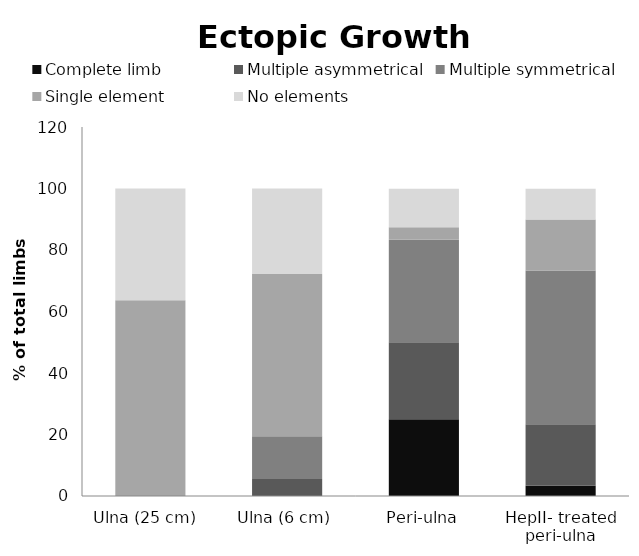
| Category | Complete limb | Multiple asymmetrical | Multiple symmetrical | Single element | No elements |
|---|---|---|---|---|---|
| Ulna (25 cm)  | 0 | 0 | 0 | 63.636 | 36.364 |
| Ulna (6 cm) | 0 | 5.556 | 13.889 | 52.778 | 27.778 |
| Peri-ulna | 25 | 25 | 33.3 | 4.1 | 12.5 |
| HepII- treated peri-ulna | 3.3 | 20 | 50 | 16.6 | 10 |